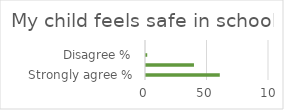
| Category | Series 1 |
|---|---|
| Strongly agree % | 60 |
| Agree % | 39 |
| Disagree % | 1 |
| Strongly disagree % | 0 |